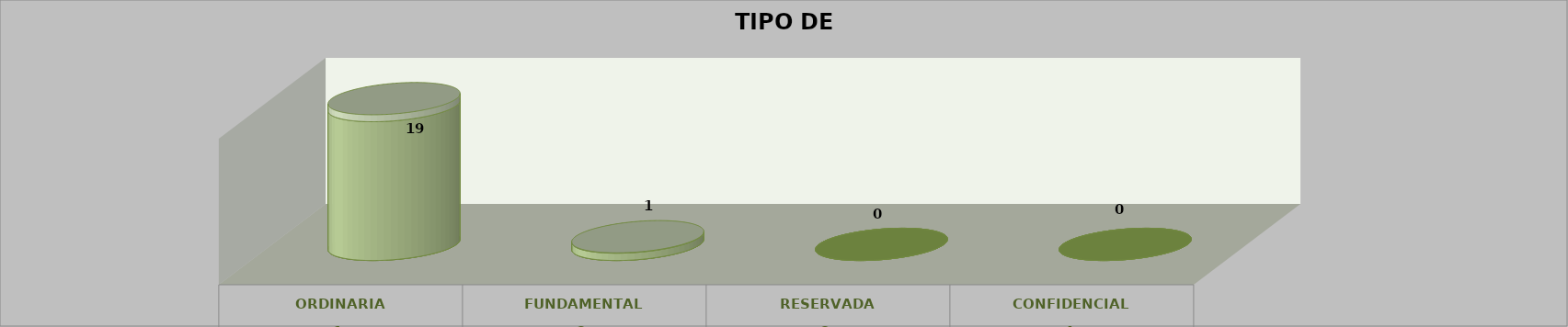
| Category | Series 0 | Series 2 | Series 1 | Series 3 | Series 4 |
|---|---|---|---|---|---|
| 0 |  |  |  | 19 | 0.95 |
| 1 |  |  |  | 1 | 0.05 |
| 2 |  |  |  | 0 | 0 |
| 3 |  |  |  | 0 | 0 |